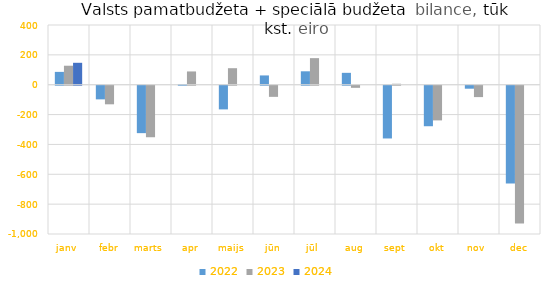
| Category | 2022 | 2023 | 2024 |
|---|---|---|---|
| janv | 85977.566 | 127204.091 | 146817.044 |
| febr | -91449.582 | -124563.375 | 0 |
| marts | -317726.304 | -345186.23 | 0 |
| apr | 4462.198 | 88892.873 | 0 |
| maijs | -158594.854 | 110598.178 | 0 |
| jūn | 62199.471 | -74676.403 | 0 |
| jūl | 89874.872 | 178052.175 | 0 |
| aug | 79584.039 | -14215.982 | 0 |
| sept | -353345.335 | 6441.615 | 0 |
| okt | -271420.986 | -232336.483 | 0 |
| nov | -20014.95 | -76225.649 | 0 |
| dec | -655267.986 | -923572.73 | 0 |